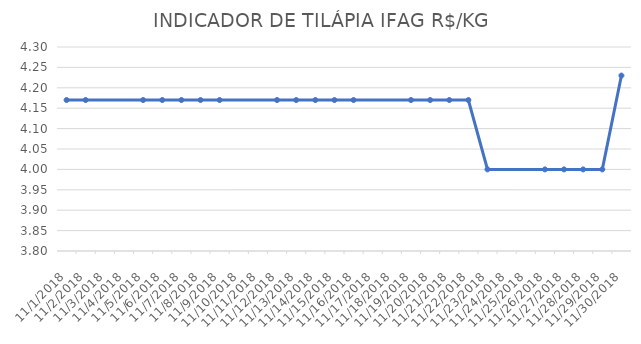
| Category | INDICADOR DE TILÁPIA IFAG |
|---|---|
| 11/1/18 | 4.17 |
| 11/2/18 | 4.17 |
| 11/5/18 | 4.17 |
| 11/6/18 | 4.17 |
| 11/7/18 | 4.17 |
| 11/8/18 | 4.17 |
| 11/9/18 | 4.17 |
| 11/12/18 | 4.17 |
| 11/13/18 | 4.17 |
| 11/14/18 | 4.17 |
| 11/15/18 | 4.17 |
| 11/16/18 | 4.17 |
| 11/19/18 | 4.17 |
| 11/20/18 | 4.17 |
| 11/21/18 | 4.17 |
| 11/22/18 | 4.17 |
| 11/23/18 | 4 |
| 11/26/18 | 4 |
| 11/27/18 | 4 |
| 11/28/18 | 4 |
| 11/29/18 | 4 |
| 11/30/18 | 4.23 |